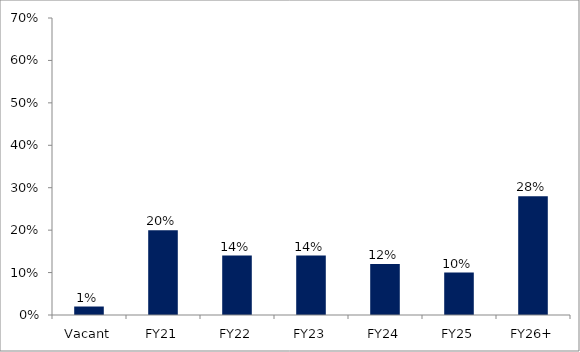
| Category | Series 0 |
|---|---|
| Vacant | 0.02 |
| FY21 | 0.2 |
| FY22 | 0.14 |
| FY23 | 0.14 |
| FY24 | 0.12 |
| FY25 | 0.1 |
| FY26+ | 0.28 |